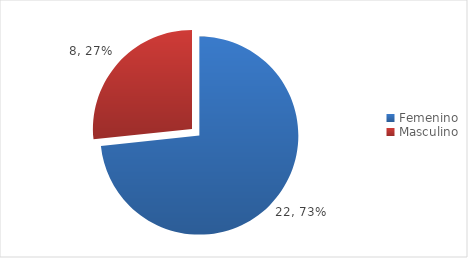
| Category | Series 0 |
|---|---|
| Femenino | 22 |
| Masculino | 8 |